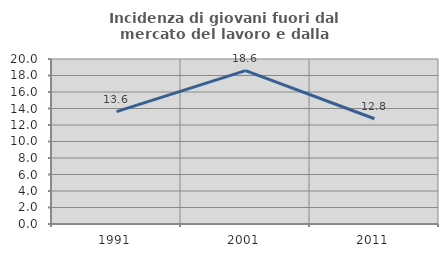
| Category | Incidenza di giovani fuori dal mercato del lavoro e dalla formazione  |
|---|---|
| 1991.0 | 13.628 |
| 2001.0 | 18.583 |
| 2011.0 | 12.757 |